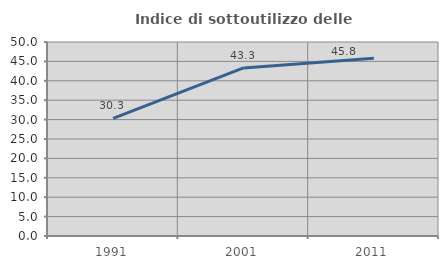
| Category | Indice di sottoutilizzo delle abitazioni  |
|---|---|
| 1991.0 | 30.315 |
| 2001.0 | 43.31 |
| 2011.0 | 45.802 |